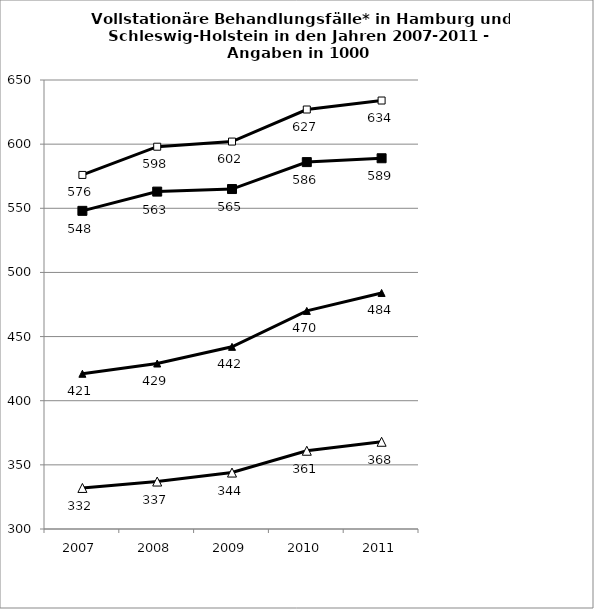
| Category | Behandlungsort Hamburg | Behandlungsort Schleswig-Holstein | Wohnort Hamburg | Wohnort Schleswig-Holstein |
|---|---|---|---|---|
| 2007 | 421 | 548 | 332 | 576 |
| 2008 | 429 | 563 | 337 | 598 |
| 2009 | 442 | 565 | 344 | 602 |
| 2010 | 470 | 586 | 361 | 627 |
| 2011 | 484 | 589 | 368 | 634 |